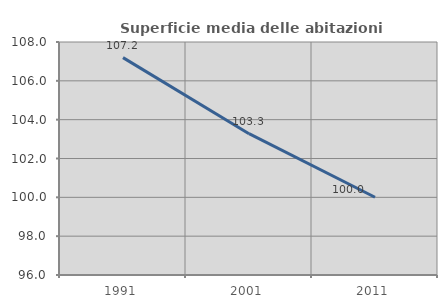
| Category | Superficie media delle abitazioni occupate |
|---|---|
| 1991.0 | 107.196 |
| 2001.0 | 103.279 |
| 2011.0 | 100.003 |